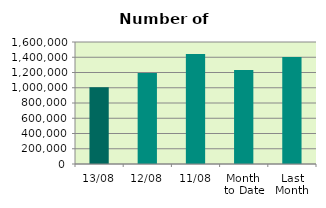
| Category | Series 0 |
|---|---|
| 13/08 | 1007306 |
| 12/08 | 1193032 |
| 11/08 | 1444096 |
| Month 
to Date | 1231844.444 |
| Last
Month | 1404253.739 |